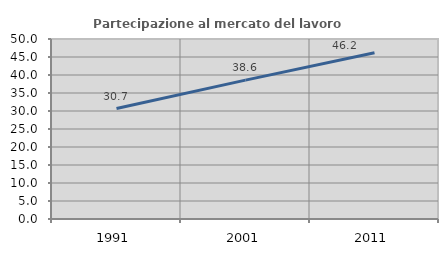
| Category | Partecipazione al mercato del lavoro  femminile |
|---|---|
| 1991.0 | 30.671 |
| 2001.0 | 38.585 |
| 2011.0 | 46.172 |